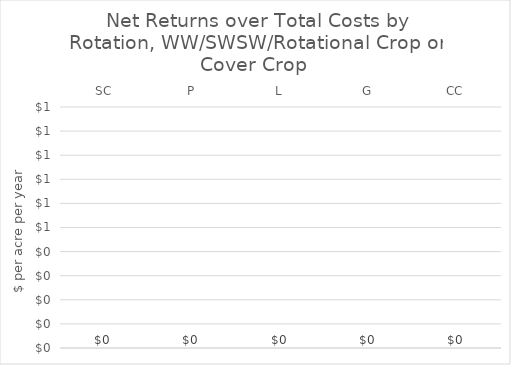
| Category | SC = spring canola |
|---|---|
| SC | 0 |
| P | 0 |
| L | 0 |
| G | 0 |
| CC | 0 |